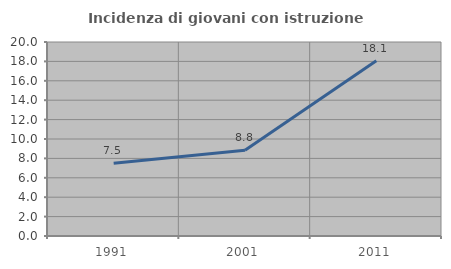
| Category | Incidenza di giovani con istruzione universitaria |
|---|---|
| 1991.0 | 7.51 |
| 2001.0 | 8.85 |
| 2011.0 | 18.068 |